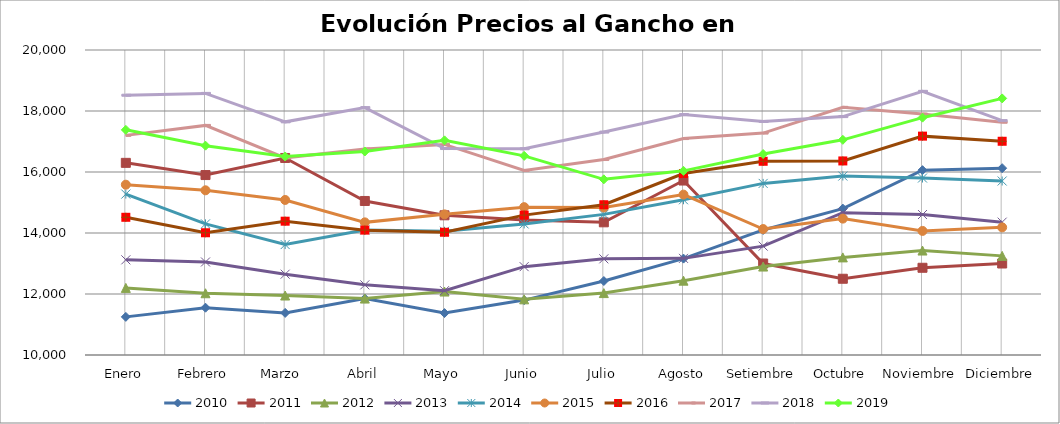
| Category | 2010 | 2011 | 2012 | 2013 | 2014 | 2015 | 2016 | 2017 | 2018 | 2019 |
|---|---|---|---|---|---|---|---|---|---|---|
| Enero | 11250 | 16300 | 12200 | 13120 | 15275.625 | 15583.75 | 14515 | 17201 | 18517.4 | 17382.1 |
| Febrero | 11550 | 15900 | 12025 | 13050 | 14299.375 | 15400.25 | 14008 | 17527.625 | 18577.075 | 16862.75 |
| Marzo  | 11380 | 16460 | 11950 | 12650 | 13620.5 | 15083.625 | 14387 | 16463.72 | 17644.575 | 16508.375 |
| Abril | 11850 | 15050 | 11850 | 12300 | 14099.8 | 14348.8 | 14093.95 | 16756.85 | 18111.25 | 16672.5 |
| Mayo | 11375 | 14580 | 12080 | 12109.5 | 14056.875 | 14611.125 | 14024.475 | 16903.96 | 16769.3 | 17037.8 |
| Junio | 11800 | 14425 | 11825 | 12896.25 | 14296.5 | 14848 | 14586.5 | 16050.5 | 16760.875 | 16528.875 |
| Julio | 12425 | 14350 | 12030 | 13152.68 | 14610.2 | 14837.5 | 14927.175 | 16409.05 | 17308.75 | 15759.64 |
| Agosto | 13160 | 15720 | 12437.5 | 13168.375 | 15089.375 | 15258.75 | 15951.16 | 17096.02 | 17883.1 | 16037.45 |
| Setiembre | 14100 | 13000 | 12900 | 13569.225 | 15626.125 | 14130 | 16351.262 | 17275.65 | 17657.5 | 16588 |
| Octubre | 14800 | 12500 | 13200 | 14666.5 | 15867.65 | 14471.625 | 16362.575 | 18119.925 | 17816.1 | 17054.87 |
| Noviembre | 16060 | 12860 | 13425 | 14605.75 | 15802.125 | 14068 | 17175.96 | 17900.8 | 18644.562 | 17781.288 |
| Diciembre | 16125 | 13000 | 13250 | 14355.75 | 15704.7 | 14185 | 17007.7 | 17630.938 | 17685.5 | 18412.675 |